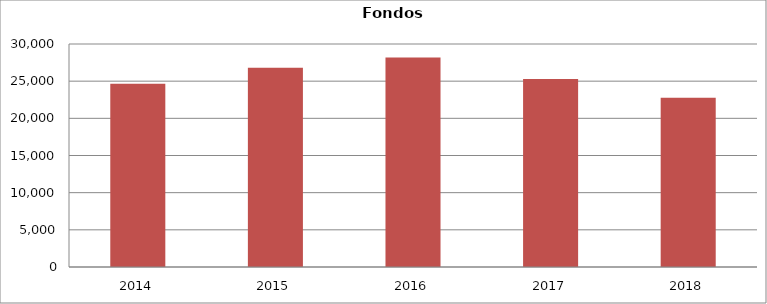
| Category | Fondos Catalogados |
|---|---|
| 2014.0 | 24669 |
| 2015.0 | 26816 |
| 2016.0 | 28174 |
| 2017.0 | 25297 |
| 2018.0 | 22776 |